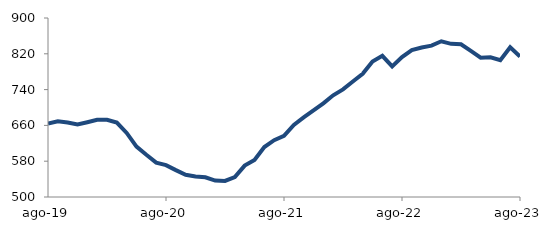
| Category | Series 0 |
|---|---|
| 2019-08-01 | 664.104 |
| 2019-09-01 | 669.196 |
| 2019-10-01 | 666.5 |
| 2019-11-01 | 662.174 |
| 2019-12-01 | 667.143 |
| 2020-01-01 | 672.455 |
| 2020-02-01 | 672.659 |
| 2020-03-01 | 666.213 |
| 2020-04-01 | 643.145 |
| 2020-05-01 | 612.572 |
| 2020-06-01 | 594.292 |
| 2020-07-01 | 576.858 |
| 2020-08-01 | 571.224 |
| 2020-09-01 | 560.032 |
| 2020-10-01 | 549.541 |
| 2020-11-01 | 545.982 |
| 2020-12-01 | 544.038 |
| 2021-01-01 | 536.772 |
| 2021-02-01 | 535.938 |
| 2021-03-01 | 544.717 |
| 2021-04-01 | 570.16 |
| 2021-05-01 | 582.981 |
| 2021-06-01 | 611.684 |
| 2021-07-01 | 627.037 |
| 2021-08-01 | 636.642 |
| 2021-09-01 | 661.114 |
| 2021-10-01 | 677.889 |
| 2021-11-01 | 693.389 |
| 2021-12-01 | 709.343 |
| 2022-01-01 | 727.31 |
| 2022-02-01 | 740.539 |
| 2022-03-01 | 758.027 |
| 2022-04-01 | 775.241 |
| 2022-05-01 | 802.956 |
| 2022-06-01 | 815.434 |
| 2022-07-01 | 791.89 |
| 2022-08-01 | 812.76 |
| 2022-09-01 | 828.12 |
| 2022-10-01 | 834 |
| 2022-11-01 | 838.178 |
| 2022-12-01 | 847.954 |
| 2023-01-01 | 842.285 |
| 2023-02-01 | 841.25 |
| 2023-03-01 | 826.38 |
| 2023-04-01 | 811.394 |
| 2023-05-01 | 812.228 |
| 2023-06-01 | 805.926 |
| 2023-07-01 | 834.815 |
| 2023-08-01 | 814.103 |